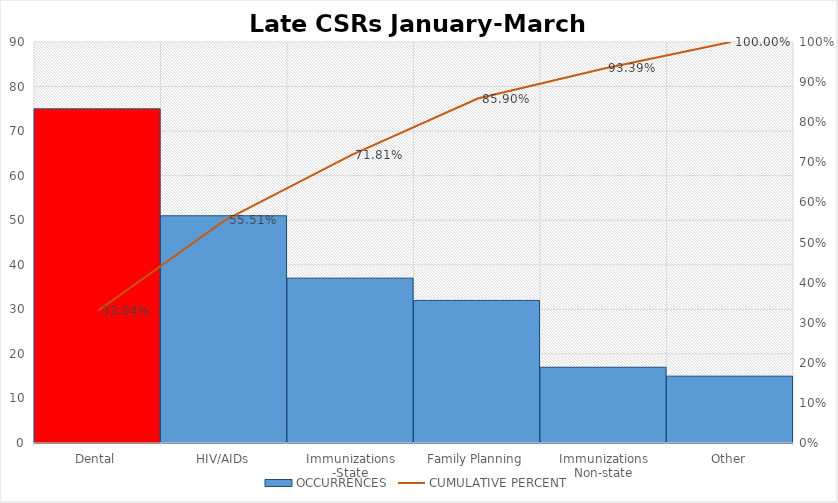
| Category | OCCURRENCES |
|---|---|
| Dental | 75 |
| HIV/AIDs | 51 |
| Immunizations -State | 37 |
| Family Planning | 32 |
| Immunizations Non-state | 17 |
| Other | 15 |